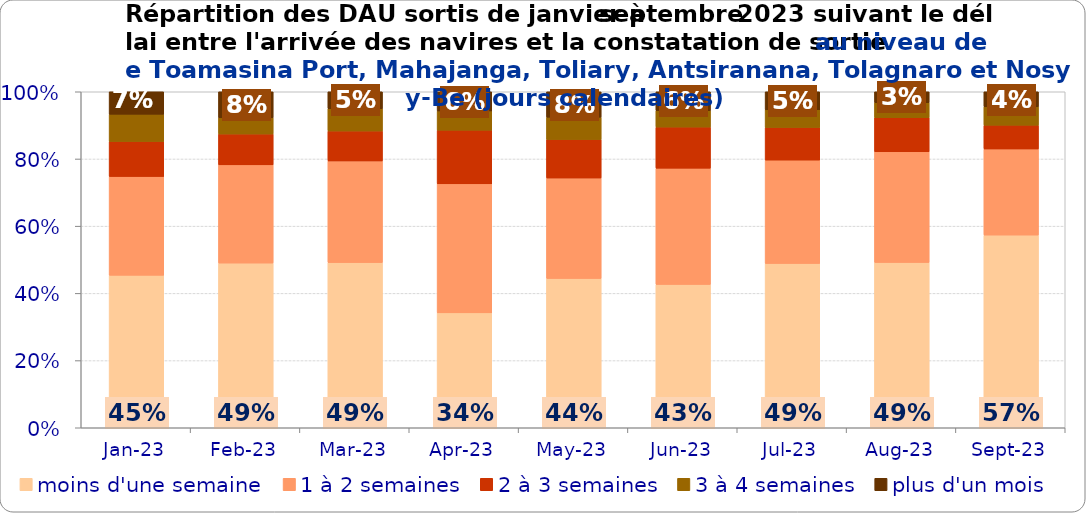
| Category | moins d'une semaine | 1 à 2 semaines | 2 à 3 semaines | 3 à 4 semaines | plus d'un mois |
|---|---|---|---|---|---|
| 2023-01-01 | 0.454 | 0.294 | 0.104 | 0.081 | 0.067 |
| 2023-02-01 | 0.49 | 0.292 | 0.092 | 0.048 | 0.078 |
| 2023-03-01 | 0.492 | 0.303 | 0.089 | 0.066 | 0.051 |
| 2023-04-01 | 0.342 | 0.384 | 0.16 | 0.057 | 0.057 |
| 2023-05-01 | 0.444 | 0.299 | 0.115 | 0.066 | 0.076 |
| 2023-06-01 | 0.427 | 0.346 | 0.122 | 0.049 | 0.056 |
| 2023-07-01 | 0.489 | 0.308 | 0.097 | 0.053 | 0.054 |
| 2023-08-01 | 0.492 | 0.33 | 0.101 | 0.045 | 0.032 |
| 2023-09-01 | 0.573 | 0.256 | 0.071 | 0.055 | 0.045 |